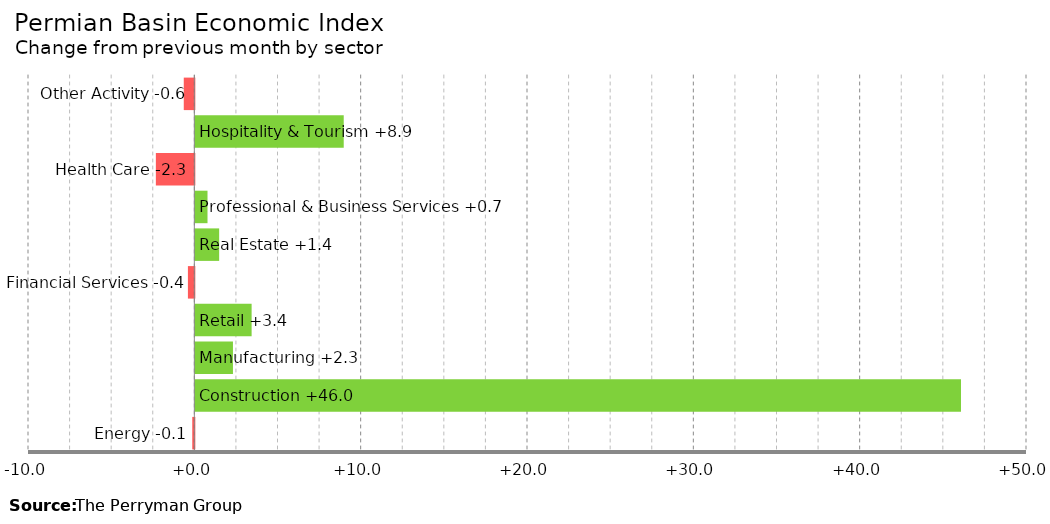
| Category | Change |
|---|---|
| Energy | -0.125 |
| Construction | 46.032 |
| Manufacturing | 2.262 |
| Retail | 3.384 |
| Financial Services | -0.386 |
| Real Estate | 1.432 |
| Professional & Business Services | 0.732 |
| Health Care | -2.313 |
| Hospitality & Tourism | 8.922 |
| Other Activity | -0.635 |